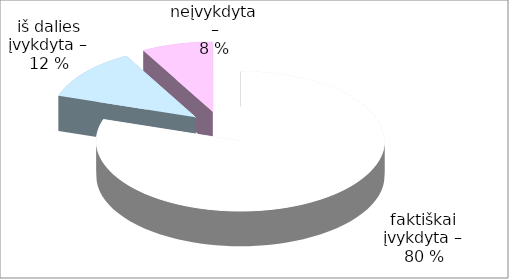
| Category | Series 0 |
|---|---|
| 0 | 20 |
| 1 | 3 |
| 2 | 2 |